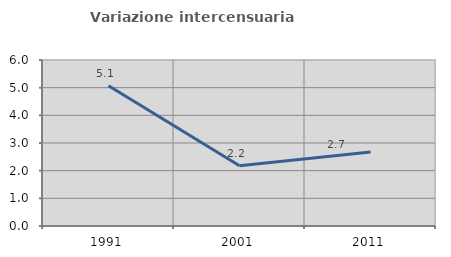
| Category | Variazione intercensuaria annua |
|---|---|
| 1991.0 | 5.069 |
| 2001.0 | 2.176 |
| 2011.0 | 2.676 |